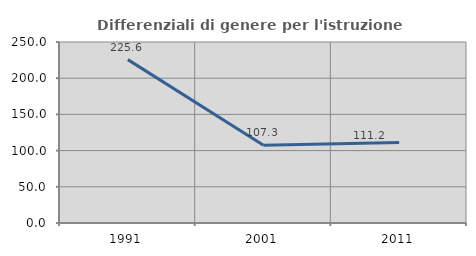
| Category | Differenziali di genere per l'istruzione superiore |
|---|---|
| 1991.0 | 225.642 |
| 2001.0 | 107.308 |
| 2011.0 | 111.236 |